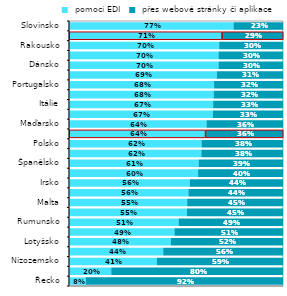
| Category |  pomocí EDI |  přes webové stránky či aplikace |
|---|---|---|
| Řecko | 0.079 | 0.921 |
| Kypr | 0.197 | 0.803 |
| Nizozemsko | 0.411 | 0.589 |
| Litva | 0.44 | 0.56 |
| Lotyšsko | 0.476 | 0.524 |
| Bulharsko | 0.493 | 0.507 |
| Rumunsko | 0.512 | 0.488 |
| Chorvatsko | 0.551 | 0.449 |
| Malta | 0.552 | 0.448 |
| Belgie | 0.558 | 0.442 |
| Irsko | 0.565 | 0.435 |
| Švédsko | 0.603 | 0.397 |
| Španělsko | 0.606 | 0.394 |
| Estonsko | 0.618 | 0.382 |
| Polsko | 0.62 | 0.38 |
| EU27 | 0.637 | 0.363 |
| Maďarsko | 0.643 | 0.357 |
| Německo | 0.672 | 0.328 |
| Itálie | 0.674 | 0.326 |
| Francie | 0.676 | 0.324 |
| Portugalsko | 0.678 | 0.322 |
| Finsko | 0.691 | 0.309 |
| Dánsko | 0.699 | 0.301 |
| Slovensko | 0.699 | 0.301 |
| Rakousko | 0.702 | 0.298 |
| Česko | 0.714 | 0.286 |
| Slovinsko | 0.769 | 0.231 |